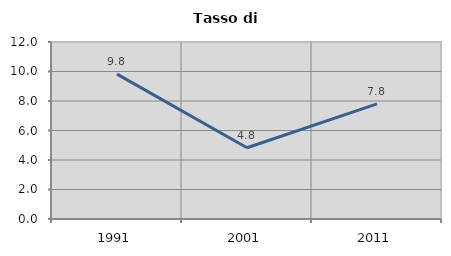
| Category | Tasso di disoccupazione   |
|---|---|
| 1991.0 | 9.819 |
| 2001.0 | 4.833 |
| 2011.0 | 7.807 |